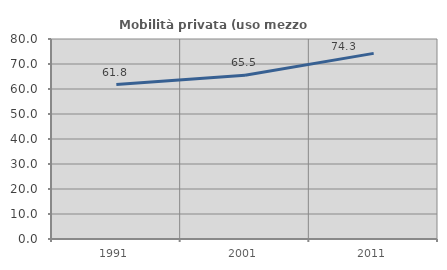
| Category | Mobilità privata (uso mezzo privato) |
|---|---|
| 1991.0 | 61.783 |
| 2001.0 | 65.537 |
| 2011.0 | 74.257 |